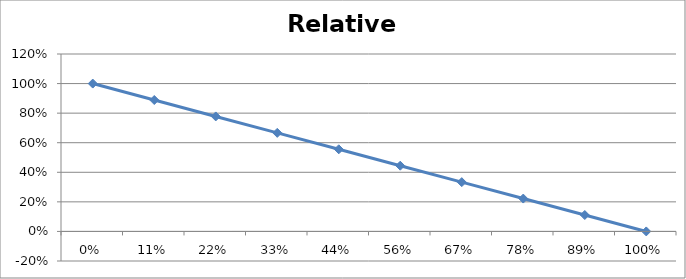
| Category | Needs of the individual |
|---|---|
| -1.66533453693773e-16 | 1 |
| 0.111111111111111 | 0.889 |
| 0.222222222222222 | 0.778 |
| 0.333333333333333 | 0.667 |
| 0.444444444444444 | 0.556 |
| 0.555555555555555 | 0.444 |
| 0.666666666666666 | 0.333 |
| 0.777777777777778 | 0.222 |
| 0.888888888888889 | 0.111 |
| 1.0 | 0 |